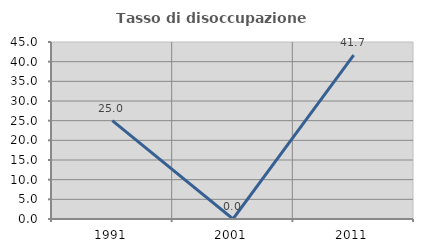
| Category | Tasso di disoccupazione giovanile  |
|---|---|
| 1991.0 | 25 |
| 2001.0 | 0 |
| 2011.0 | 41.667 |